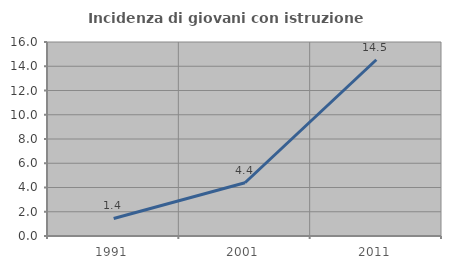
| Category | Incidenza di giovani con istruzione universitaria |
|---|---|
| 1991.0 | 1.449 |
| 2001.0 | 4.39 |
| 2011.0 | 14.535 |